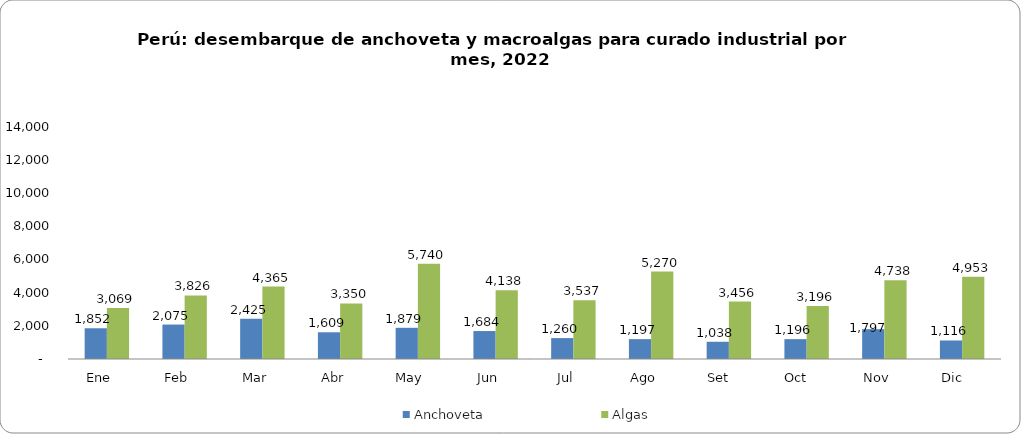
| Category | Anchoveta | Algas |
|---|---|---|
| Ene    | 1851.686 | 3069.389 |
| Feb    | 2074.627 | 3826.454 |
| Mar    | 2425.187 | 4365.389 |
| Abr    | 1609.364 | 3350.33 |
| May    | 1879.265 | 5740.36 |
| Jun    | 1684.378 | 4138.4 |
| Jul    | 1259.758 | 3537.24 |
| Ago    | 1197.489 | 5269.845 |
| Set     | 1038.262 | 3456.46 |
| Oct     | 1195.728 | 3195.592 |
| Nov    | 1797.356 | 4737.686 |
| Dic     | 1115.557 | 4953.399 |